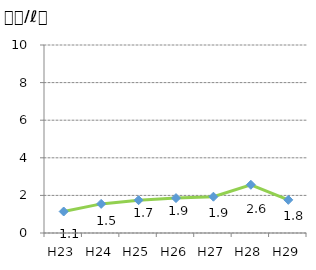
| Category | Series 0 |
|---|---|
| H23 | 1.143 |
| H24 | 1.549 |
| H25 | 1.746 |
| H26 | 1.857 |
| H27 | 1.931 |
| H28 | 2.565 |
| H29 | 1.763 |